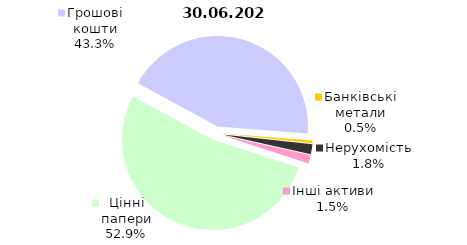
| Category | Series 0 |
|---|---|
| Цінні папери | 2372.621 |
| Грошові кошти | 1940.881 |
| Банківські метали | 20.695 |
| Нерухомість | 80.119 |
| Інші активи | 67.181 |